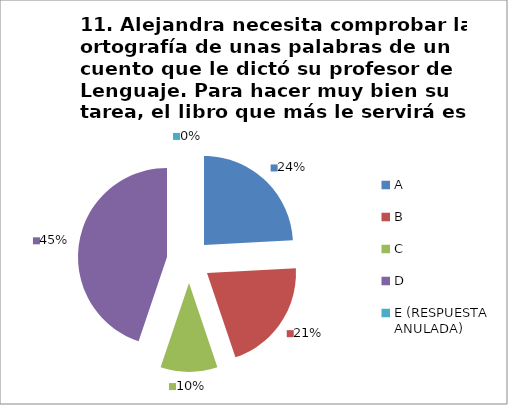
| Category | CANTIDAD DE RESPUESTAS PREGUNTA (11) | PORCENTAJE |
|---|---|---|
| A | 7 | 0.241 |
| B | 6 | 0.207 |
| C | 3 | 0.103 |
| D | 13 | 0.448 |
| E (RESPUESTA ANULADA) | 0 | 0 |